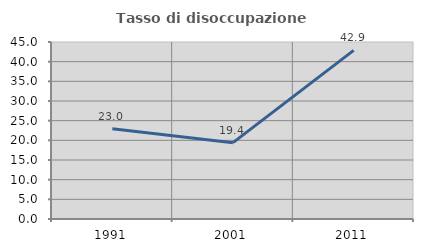
| Category | Tasso di disoccupazione giovanile  |
|---|---|
| 1991.0 | 22.951 |
| 2001.0 | 19.403 |
| 2011.0 | 42.857 |